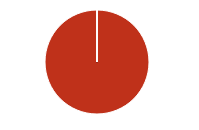
| Category | Total |
|---|---|
| Y | 0 |
| R | 0 |
| T | 0 |
| M | 0 |
| F | 0 |
| N | 369 |